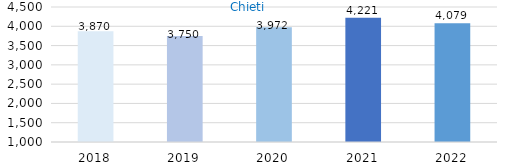
| Category | Series 0 |
|---|---|
| 2018.0 | 3870 |
| 2019.0 | 3750 |
| 2020.0 | 3972 |
| 2021.0 | 4221 |
| 2022.0 | 4079 |